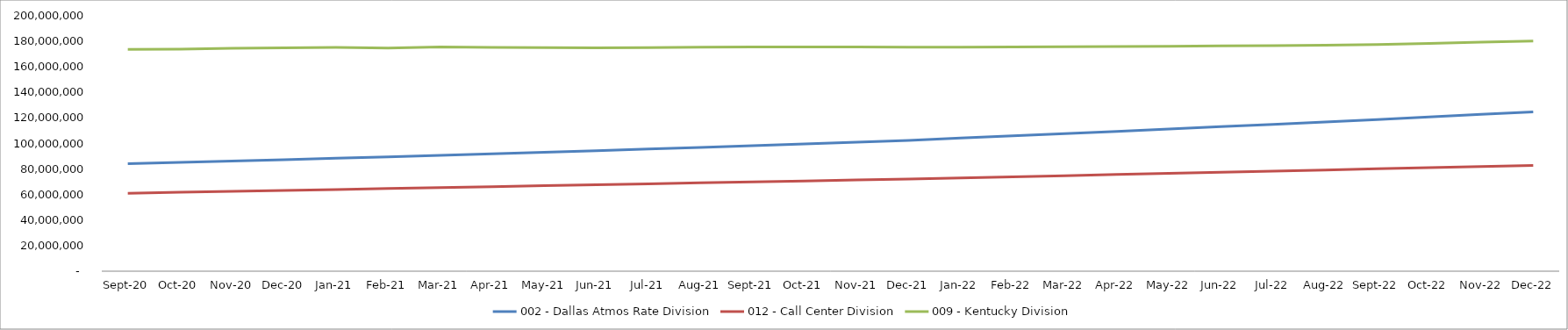
| Category | 002 - Dallas Atmos Rate Division | 012 - Call Center Division | 009 - Kentucky Division |
|---|---|---|---|
| 2020-09-30 | 84144064.22 | 61073043.16 | 173659852.36 |
| 2020-10-31 | 85224244.29 | 61803832.31 | 173935529.38 |
| 2020-11-30 | 86296435.05 | 62534617.85 | 174552567.84 |
| 2020-12-31 | 87353292.01 | 63268363.39 | 174865398.69 |
| 2021-01-31 | 88477832.14 | 64002130.25 | 175248443.54 |
| 2021-02-28 | 89598027.17 | 64738251.76 | 174819159.2 |
| 2021-03-31 | 90710834.14 | 65474355.99 | 175532570.29 |
| 2021-04-30 | 91906865.252 | 66216810.077 | 175321309.116 |
| 2021-05-31 | 93129937.289 | 66959119.689 | 175150088.078 |
| 2021-06-30 | 94379285.732 | 67701956.729 | 174988450.999 |
| 2021-07-31 | 95652816.327 | 68445317.972 | 175069149.111 |
| 2021-08-31 | 96949393.499 | 69189203.931 | 175512401.076 |
| 2021-09-30 | 98268953.276 | 69933611.476 | 175590173.877 |
| 2021-10-31 | 99624440.784 | 70678582.593 | 175572523.665 |
| 2021-11-30 | 101010792.867 | 71424241.184 | 175527359.008 |
| 2021-12-31 | 102431770.488 | 72169891.916 | 175388112.612 |
| 2022-01-31 | 104225376.862 | 73052336.78 | 175465913.738 |
| 2022-02-28 | 105948448.964 | 73939342.15 | 175609611.722 |
| 2022-03-31 | 107671768.099 | 74826352.529 | 175805235.169 |
| 2022-04-30 | 109414854.329 | 75714084.924 | 176004933.65 |
| 2022-05-31 | 111264518.869 | 76602543.03 | 176190021.61 |
| 2022-06-30 | 113147682.669 | 77491722.413 | 176411858.153 |
| 2022-07-31 | 114989117.74 | 78381623.777 | 176686352.094 |
| 2022-08-31 | 116906109.94 | 79272242.815 | 177043247.665 |
| 2022-09-30 | 118779506.764 | 80163637.299 | 177424264.07 |
| 2022-10-31 | 120776812.797 | 81055977.709 | 178393312.542 |
| 2022-11-30 | 122807288.109 | 81948307.306 | 179366229.016 |
| 2022-12-31 | 124816300.336 | 82847280.466 | 180290169.074 |